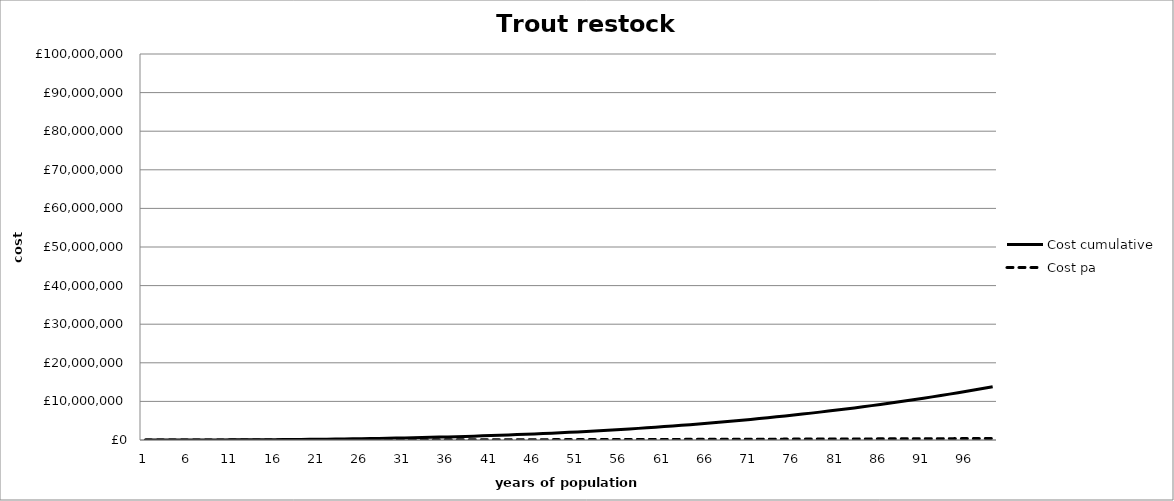
| Category | Cost pa | Cost cumulative |
|---|---|---|
| 0 | 0 | 0 |
| 1 | 337.5 | 337.5 |
| 2 | 750 | 1087.5 |
| 3 | 1237.5 | 2325 |
| 4 | 1800 | 4125 |
| 5 | 2437.5 | 6562.5 |
| 6 | 3150 | 9712.5 |
| 7 | 3937.5 | 13650 |
| 8 | 4800 | 18450 |
| 9 | 5737.5 | 24187.5 |
| 10 | 6750 | 30937.5 |
| 11 | 7837.5 | 38775 |
| 12 | 9000 | 47775 |
| 13 | 10237.5 | 58012.5 |
| 14 | 11550 | 69562.5 |
| 15 | 12937.5 | 82500 |
| 16 | 14400 | 96900 |
| 17 | 15937.5 | 112837.5 |
| 18 | 17550 | 130387.5 |
| 19 | 19237.5 | 149625 |
| 20 | 21000 | 170625 |
| 21 | 22837.5 | 193462.5 |
| 22 | 24750 | 218212.5 |
| 23 | 26737.5 | 244950 |
| 24 | 28800 | 273750 |
| 25 | 30937.5 | 304687.5 |
| 26 | 33150 | 337837.5 |
| 27 | 35437.5 | 373275 |
| 28 | 37800 | 411075 |
| 29 | 40237.5 | 451312.5 |
| 30 | 42750 | 494062.5 |
| 31 | 45337.5 | 539400 |
| 32 | 48000 | 587400 |
| 33 | 50737.5 | 638137.5 |
| 34 | 53550 | 691687.5 |
| 35 | 56437.5 | 748125 |
| 36 | 59400 | 807525 |
| 37 | 62437.5 | 869962.5 |
| 38 | 65550 | 935512.5 |
| 39 | 68737.5 | 1004250 |
| 40 | 72000 | 1076250 |
| 41 | 75337.5 | 1151587.5 |
| 42 | 78750 | 1230337.5 |
| 43 | 82237.5 | 1312575 |
| 44 | 85800 | 1398375 |
| 45 | 89437.5 | 1487812.5 |
| 46 | 93150 | 1580962.5 |
| 47 | 96937.5 | 1677900 |
| 48 | 100800 | 1778700 |
| 49 | 104737.5 | 1883437.5 |
| 50 | 108750 | 1992187.5 |
| 51 | 112837.5 | 2105025 |
| 52 | 117000 | 2222025 |
| 53 | 121237.5 | 2343262.5 |
| 54 | 125550 | 2468812.5 |
| 55 | 129937.5 | 2598750 |
| 56 | 134400 | 2733150 |
| 57 | 138937.5 | 2872087.5 |
| 58 | 143550 | 3015637.5 |
| 59 | 148237.5 | 3163875 |
| 60 | 153000 | 3316875 |
| 61 | 157837.5 | 3474712.5 |
| 62 | 162750 | 3637462.5 |
| 63 | 167737.5 | 3805200 |
| 64 | 172800 | 3978000 |
| 65 | 177937.5 | 4155937.5 |
| 66 | 183150 | 4339087.5 |
| 67 | 188437.5 | 4527525 |
| 68 | 193800 | 4721325 |
| 69 | 199237.5 | 4920562.5 |
| 70 | 204750 | 5125312.5 |
| 71 | 210337.5 | 5335650 |
| 72 | 216000 | 5551650 |
| 73 | 221737.5 | 5773387.5 |
| 74 | 227550 | 6000937.5 |
| 75 | 233437.5 | 6234375 |
| 76 | 239400 | 6473775 |
| 77 | 245437.5 | 6719212.5 |
| 78 | 251550 | 6970762.5 |
| 79 | 257737.5 | 7228500 |
| 80 | 264000 | 7492500 |
| 81 | 270337.5 | 7762837.5 |
| 82 | 276750 | 8039587.5 |
| 83 | 283237.5 | 8322825 |
| 84 | 289800 | 8612625 |
| 85 | 296437.5 | 8909062.5 |
| 86 | 303150 | 9212212.5 |
| 87 | 309937.5 | 9522150 |
| 88 | 316800 | 9838950 |
| 89 | 323737.5 | 10162687.5 |
| 90 | 330750 | 10493437.5 |
| 91 | 337837.5 | 10831275 |
| 92 | 345000 | 11176275 |
| 93 | 352237.5 | 11528512.5 |
| 94 | 359550 | 11888062.5 |
| 95 | 366937.5 | 12255000 |
| 96 | 374400 | 12629400 |
| 97 | 381937.5 | 13011337.5 |
| 98 | 389550 | 13400887.5 |